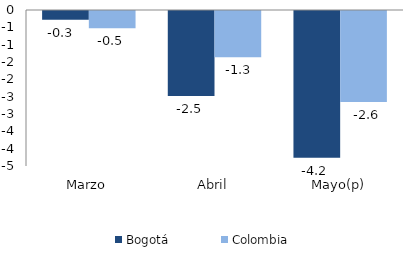
| Category | Bogotá | Colombia |
|---|---|---|
| Marzo | -0.25 | -0.5 |
| Abril | -2.451 | -1.331 |
| Mayo(p) | -4.234 | -2.628 |